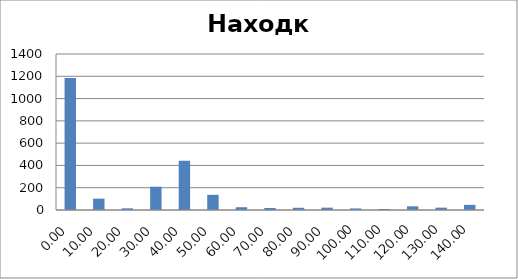
| Category | Series 0 |
|---|---|
| 0.0 | 1184 |
| 10.0 | 102 |
| 20.0 | 15 |
| 30.0 | 209 |
| 40.0 | 442 |
| 50.0 | 136 |
| 60.0 | 25 |
| 70.0 | 18 |
| 80.0 | 20 |
| 90.0 | 21 |
| 100.0 | 14 |
| 110.0 | 9 |
| 120.0 | 33 |
| 130.0 | 21 |
| 140.0 | 46 |